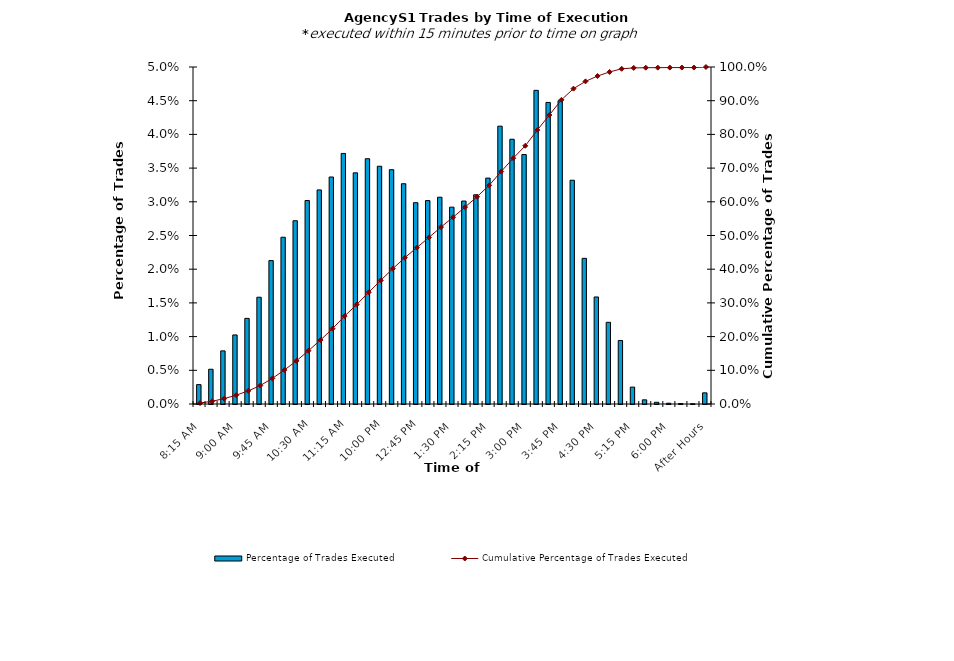
| Category | Percentage of Trades Executed |
|---|---|
| 8:15 AM | 0.003 |
| 8:30 AM | 0.005 |
| 8:45 AM | 0.008 |
| 9:00 AM | 0.01 |
| 9:15 AM | 0.013 |
| 9:30 AM | 0.016 |
| 9:45 AM | 0.021 |
| 10:00 AM | 0.025 |
| 10:15 AM | 0.027 |
| 10:30 AM | 0.03 |
| 10:45 AM | 0.032 |
| 11:00 AM | 0.034 |
| 11:15 AM | 0.037 |
| 11:30 AM | 0.034 |
| 11:45 AM | 0.036 |
| 12:00 PM | 0.035 |
| 12:15 PM | 0.035 |
| 12:30 PM | 0.033 |
| 12:45 PM | 0.03 |
| 1:00 PM | 0.03 |
| 1:15 PM | 0.031 |
| 1:30 PM | 0.029 |
| 1:45 PM | 0.03 |
| 2:00 PM | 0.031 |
| 2:15 PM | 0.034 |
| 2:30 PM | 0.041 |
| 2:45 PM | 0.039 |
| 3:00 PM | 0.037 |
| 3:15 PM | 0.047 |
| 3:30 PM | 0.045 |
| 3:45 PM | 0.045 |
| 4:00 PM | 0.033 |
| 4:15 PM | 0.022 |
| 4:30 PM | 0.016 |
| 4:45 PM | 0.012 |
| 5:00 PM | 0.009 |
| 5:15 PM | 0.003 |
| 5:30 PM | 0.001 |
| 5:45 PM | 0 |
| 6:00 PM | 0 |
| 6:15 PM | 0 |
| 6:30 PM | 0 |
| After Hours | 0.002 |